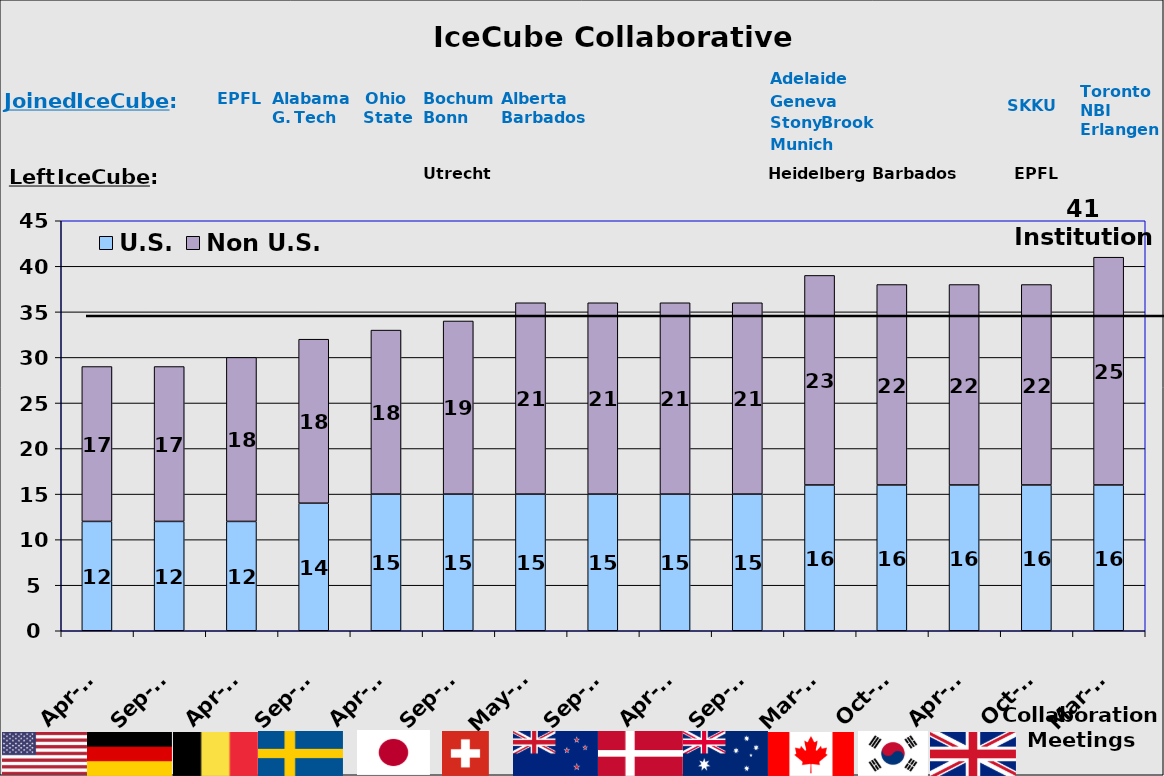
| Category | U.S. | Non U.S. |
|---|---|---|
| Apr-07 | 12 | 17 |
| Sep-07 | 12 | 17 |
| Apr-08 | 12 | 18 |
| Sep-08 | 14 | 18 |
| Apr-09 | 15 | 18 |
| Sep-09 | 15 | 19 |
| May-10 | 15 | 21 |
| Sep-10 | 15 | 21 |
| Apr-11 | 15 | 21 |
| Sep-11 | 15 | 21 |
| Mar-12 | 16 | 23 |
| Oct-12 | 16 | 22 |
| Apr-13 | 16 | 22 |
| Oct-13 | 16 | 22 |
| Mar-14 | 16 | 25 |